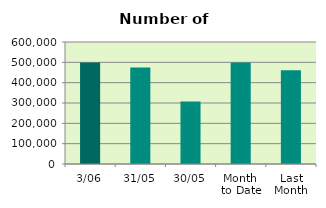
| Category | Series 0 |
|---|---|
| 3/06 | 499192 |
| 31/05 | 474872 |
| 30/05 | 307860 |
| Month 
to Date | 499192 |
| Last
Month | 461152.818 |